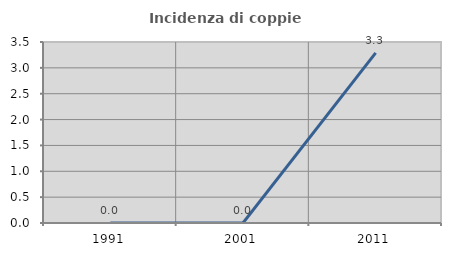
| Category | Incidenza di coppie miste |
|---|---|
| 1991.0 | 0 |
| 2001.0 | 0 |
| 2011.0 | 3.289 |